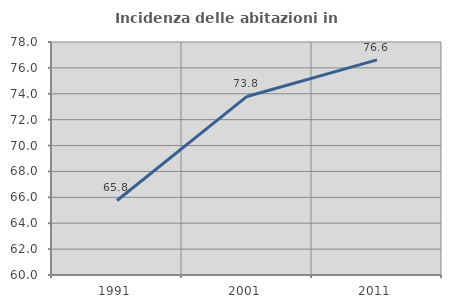
| Category | Incidenza delle abitazioni in proprietà  |
|---|---|
| 1991.0 | 65.758 |
| 2001.0 | 73.795 |
| 2011.0 | 76.618 |